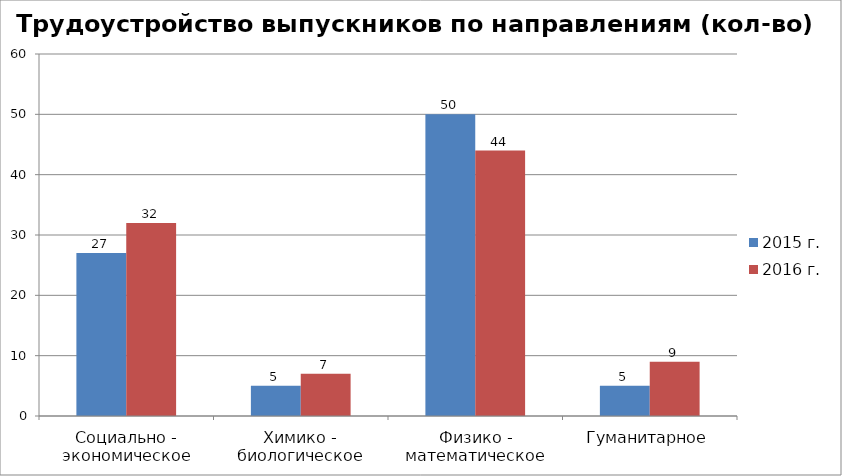
| Category | 2015 г. | 2016 г. |
|---|---|---|
| Социально - экономическое | 27 | 32 |
| Химико - биологическое | 5 | 7 |
| Физико - математическое | 50 | 44 |
| Гуманитарное | 5 | 9 |